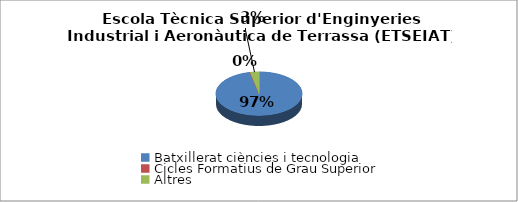
| Category | Escola Tècnica Superior d'Enginyeries Industrial i Aeronàutica de Terrassa (ETSEIAT) - Estudis cursats |
|---|---|
| Batxillerat ciències i tecnologia | 0.967 |
| Cicles Formatius de Grau Superior | 0 |
| Altres | 0.033 |